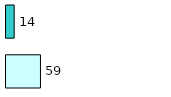
| Category | Series 0 | Series 1 |
|---|---|---|
| 0 | 59 | 14 |